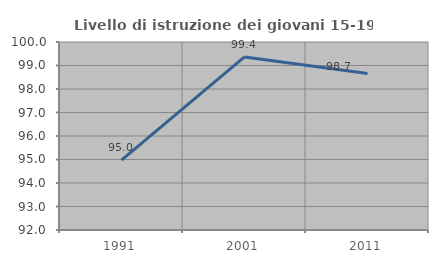
| Category | Livello di istruzione dei giovani 15-19 anni |
|---|---|
| 1991.0 | 94.975 |
| 2001.0 | 99.363 |
| 2011.0 | 98.658 |